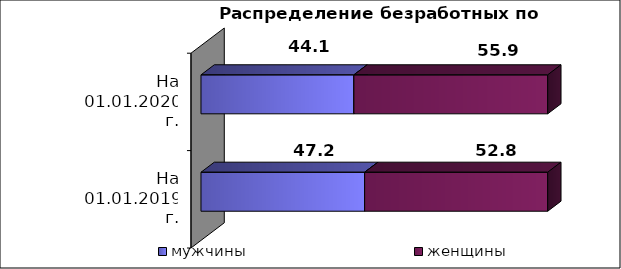
| Category | мужчины  | женщины  |
|---|---|---|
| На 01.01.2019 г. | 47.2 | 52.8 |
| На 01.01.2020 г. | 44.1 | 55.9 |